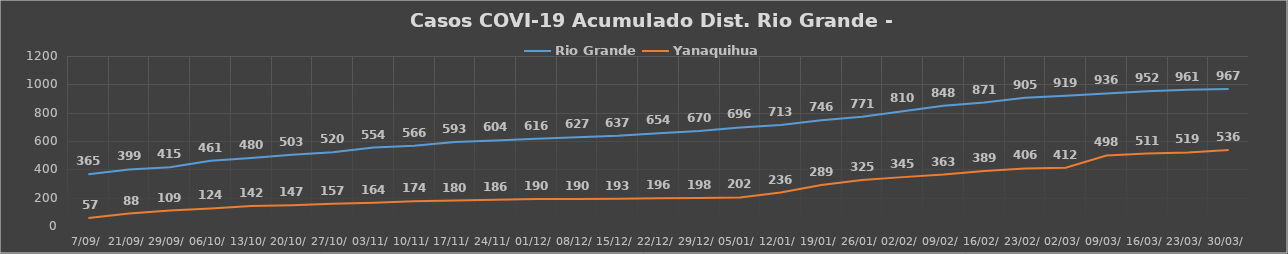
| Category | Rio Grande | Yanaquihua  |
|---|---|---|
| 7/09/ | 365 | 57 |
| 21/09/ | 399 | 88 |
| 29/09/ | 415 | 109 |
| 06/10/ | 461 | 124 |
| 13/10/ | 480 | 142 |
| 20/10/ | 503 | 147 |
| 27/10/ | 520 | 157 |
| 03/11/ | 554 | 164 |
| 10/11/ | 566 | 174 |
| 17/11/ | 593 | 180 |
| 24/11/ | 604 | 186 |
| 01/12/ | 616 | 190 |
| 08/12/ | 627 | 190 |
| 15/12/ | 637 | 193 |
| 22/12/ | 654 | 196 |
| 29/12/ | 670 | 198 |
| 05/01/ | 696 | 202 |
| 12/01/ | 713 | 236 |
| 19/01/ | 746 | 289 |
| 26/01/ | 771 | 325 |
| 02/02/ | 810 | 345 |
| 09/02/ | 848 | 363 |
| 16/02/ | 871 | 389 |
| 23/02/ | 905 | 406 |
| 02/03/ | 919 | 412 |
| 09/03/ | 936 | 498 |
| 16/03/ | 952 | 511 |
| 23/03/ | 961 | 519 |
| 30/03/ | 967 | 536 |